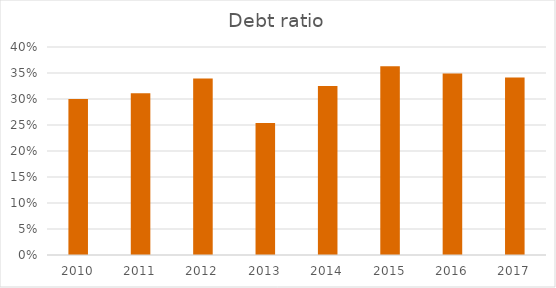
| Category | Debt ratio |
|---|---|
| 2010.0 | 0.3 |
| 2011.0 | 0.311 |
| 2012.0 | 0.339 |
| 2013.0 | 0.254 |
| 2014.0 | 0.325 |
| 2015.0 | 0.363 |
| 2016.0 | 0.349 |
| 2017.0 | 0.342 |